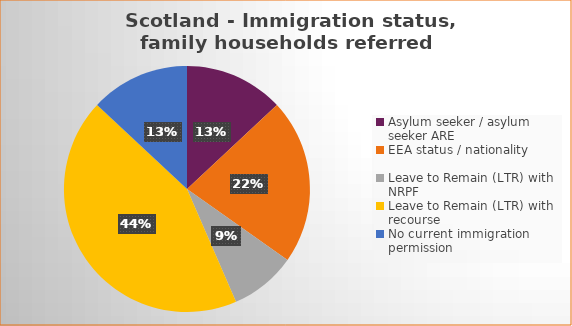
| Category | Number  | Percentage |
|---|---|---|
| Asylum seeker / asylum seeker ARE | 3 | 0.13 |
| EEA status / nationality  | 5 | 0.217 |
| Leave to Remain (LTR) with NRPF | 2 | 0.087 |
| Leave to Remain (LTR) with recourse | 10 | 0.435 |
| No current immigration permission | 3 | 0.13 |